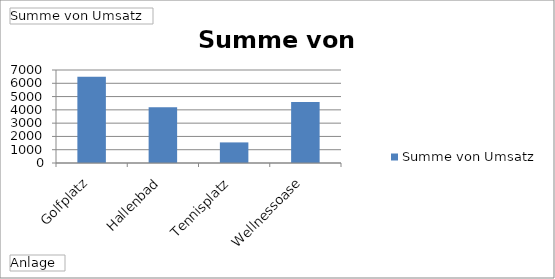
| Category | Ergebnis |
|---|---|
| Golfplatz | 6500 |
| Hallenbad | 4200 |
| Tennisplatz | 1550 |
| Wellnessoase | 4600 |